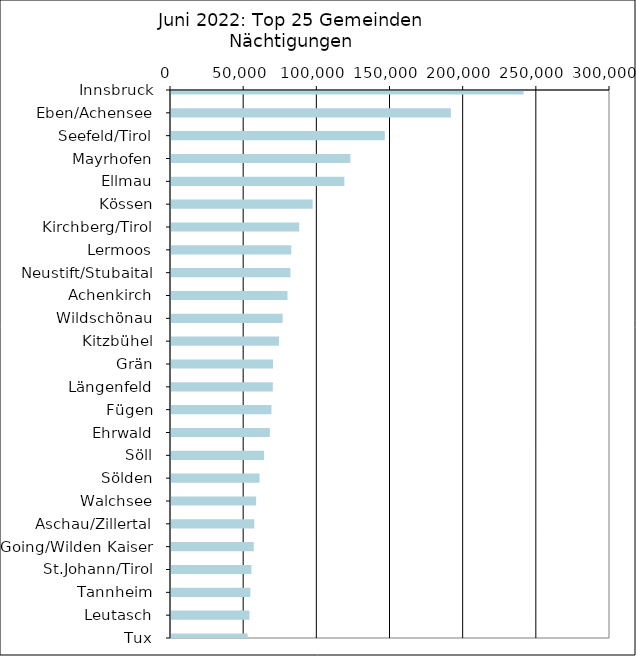
| Category | Series 0 |
|---|---|
| Innsbruck | 240998 |
| Eben/Achensee | 191247 |
| Seefeld/Tirol | 146114 |
| Mayrhofen | 122591 |
| Ellmau | 118457 |
| Kössen | 96808 |
| Kirchberg/Tirol | 87634 |
| Lermoos | 82179 |
| Neustift/Stubaital | 81625 |
| Achenkirch | 79618 |
| Wildschönau | 76317 |
| Kitzbühel | 73794 |
| Grän | 69714 |
| Längenfeld | 69583 |
| Fügen | 68671 |
| Ehrwald | 67551 |
| Söll | 63619 |
| Sölden | 60535 |
| Walchsee | 58168 |
| Aschau/Zillertal | 56919 |
| Going/Wilden Kaiser | 56557 |
| St.Johann/Tirol | 54959 |
| Tannheim | 54217 |
| Leutasch | 53627 |
| Tux | 52338 |